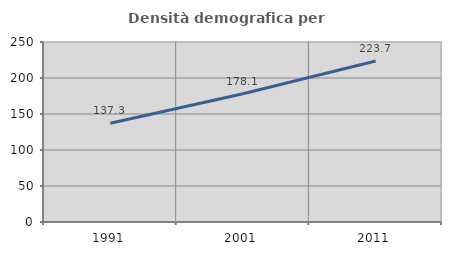
| Category | Densità demografica |
|---|---|
| 1991.0 | 137.276 |
| 2001.0 | 178.132 |
| 2011.0 | 223.696 |